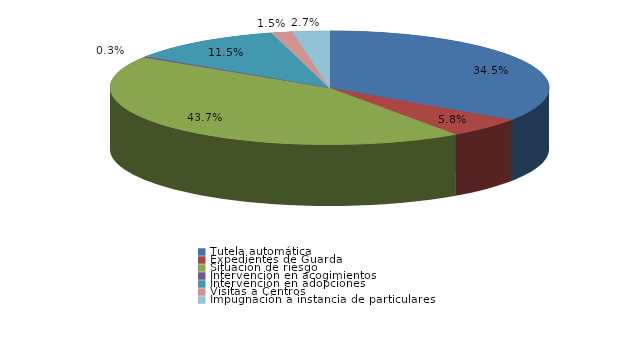
| Category | Series 0 |
|---|---|
| Tutela automática | 204 |
| Expedientes de Guarda | 34 |
| Situación de riesgo | 258 |
| Intervención en acogimientos | 2 |
| Intervención en adopciones | 68 |
| Defensa de los derechos fundamentales | 0 |
| Sustracción internacional de menores | 0 |
| Visitas a Centros | 9 |
| Ensayos Clínicos | 0 |
| Impugnación a instacia del Fiscal | 0 |
| Impugnación a instancia de particulares | 16 |